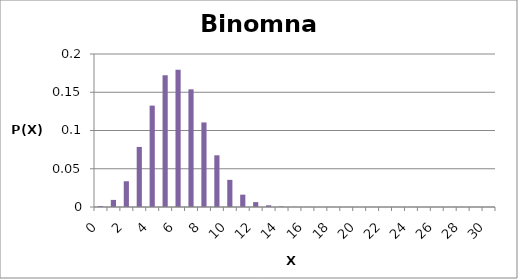
| Category | Series 0 |
|---|---|
| 0.0 | 0.001 |
| 1.0 | 0.009 |
| 2.0 | 0.034 |
| 3.0 | 0.079 |
| 4.0 | 0.133 |
| 5.0 | 0.172 |
| 6.0 | 0.179 |
| 7.0 | 0.154 |
| 8.0 | 0.111 |
| 9.0 | 0.068 |
| 10.0 | 0.035 |
| 11.0 | 0.016 |
| 12.0 | 0.006 |
| 13.0 | 0.002 |
| 14.0 | 0.001 |
| 15.0 | 0 |
| 16.0 | 0 |
| 17.0 | 0 |
| 18.0 | 0 |
| 19.0 | 0 |
| 20.0 | 0 |
| 21.0 | 0 |
| 22.0 | 0 |
| 23.0 | 0 |
| 24.0 | 0 |
| 25.0 | 0 |
| 26.0 | 0 |
| 27.0 | 0 |
| 28.0 | 0 |
| 29.0 | 0 |
| 30.0 | 0 |